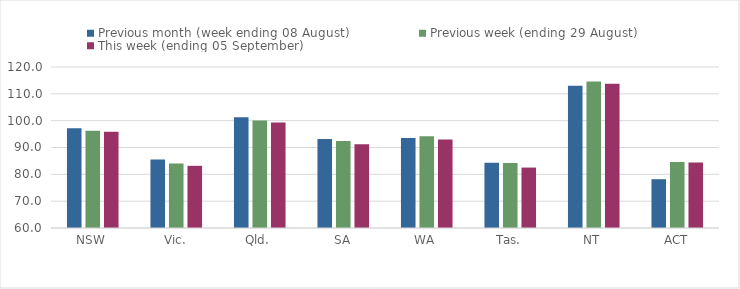
| Category | Previous month (week ending 08 August) | Previous week (ending 29 August) | This week (ending 05 September) |
|---|---|---|---|
| NSW | 97.16 | 96.28 | 95.91 |
| Vic. | 85.49 | 84.08 | 83.17 |
| Qld. | 101.29 | 100.03 | 99.33 |
| SA | 93.13 | 92.39 | 91.24 |
| WA | 93.53 | 94.16 | 92.96 |
| Tas. | 84.31 | 84.25 | 82.52 |
| NT | 113.04 | 114.58 | 113.74 |
| ACT | 78.18 | 84.55 | 84.38 |